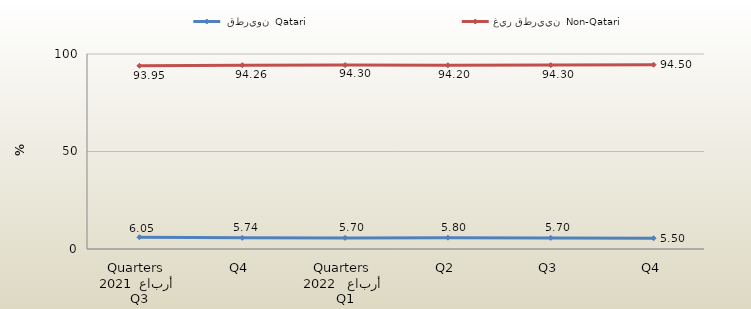
| Category |  قطريون  Qatari | غير قطريين  Non-Qatari |
|---|---|---|
| 0 | 6.047 | 93.953 |
| 1 | 5.737 | 94.263 |
| 2 | 5.7 | 94.3 |
| 3 | 5.8 | 94.2 |
| 4 | 5.7 | 94.3 |
| 5 | 5.5 | 94.5 |